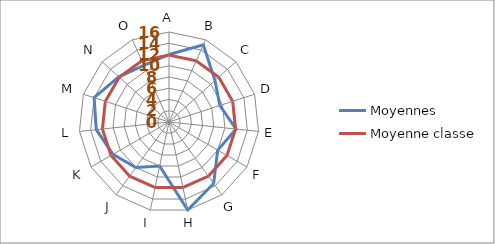
| Category | Moyennes | Moyenne classe |
|---|---|---|
| A | 12 | 11.9 |
| B | 15 | 11.9 |
| C | 11 | 11.9 |
| D | 9.5 | 11.9 |
| E | 12 | 11.9 |
| F | 10 | 11.9 |
| G | 13.5 | 11.9 |
| H | 16 | 11.9 |
| I | 8 | 11.9 |
| J | 10 | 11.9 |
| K | 11.5 | 11.9 |
| L | 13 | 11.9 |
| M | 14 | 11.9 |
| N | 12 | 11.9 |
| O | 11 | 11.9 |